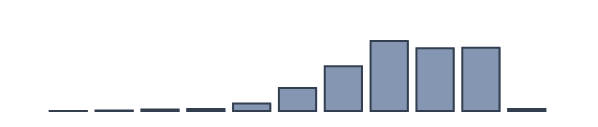
| Category | Series 0 |
|---|---|
| 0 | 0 |
| 1 | 0.043 |
| 2 | 0.174 |
| 3 | 0.522 |
| 4 | 0.739 |
| 5 | 2.739 |
| 6 | 8.261 |
| 7 | 16.087 |
| 8 | 25.217 |
| 9 | 22.652 |
| 10 | 22.826 |
| 11 | 0.739 |
| 12 | 0 |